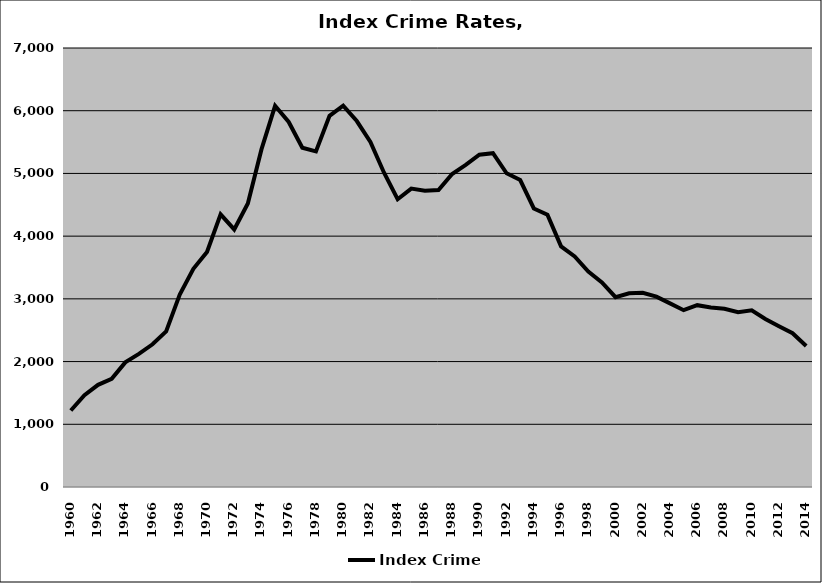
| Category | Index Crime |
|---|---|
| 1960.0 | 1219.113 |
| 1961.0 | 1462.744 |
| 1962.0 | 1629.665 |
| 1963.0 | 1725.872 |
| 1964.0 | 1987.617 |
| 1965.0 | 2121.447 |
| 1966.0 | 2275.255 |
| 1967.0 | 2482.144 |
| 1968.0 | 3067.905 |
| 1969.0 | 3478.562 |
| 1970.0 | 3746.311 |
| 1971.0 | 4347.551 |
| 1972.0 | 4107.085 |
| 1973.0 | 4520.987 |
| 1974.0 | 5382.948 |
| 1975.0 | 6077.831 |
| 1976.0 | 5820.899 |
| 1977.0 | 5409.045 |
| 1978.0 | 5350.416 |
| 1979.0 | 5917.941 |
| 1980.0 | 6079.146 |
| 1981.0 | 5835.373 |
| 1982.0 | 5503.736 |
| 1983.0 | 5010.768 |
| 1984.0 | 4588.427 |
| 1985.0 | 4757.798 |
| 1986.0 | 4723.337 |
| 1987.0 | 4733.817 |
| 1988.0 | 4990.887 |
| 1989.0 | 5136.005 |
| 1990.0 | 5297.864 |
| 1991.0 | 5322.348 |
| 1992.0 | 5002.851 |
| 1993.0 | 4893.945 |
| 1994.0 | 4441.003 |
| 1995.0 | 4341.62 |
| 1996.0 | 3837.131 |
| 1997.0 | 3675.188 |
| 1998.0 | 3435.871 |
| 1999.0 | 3262.421 |
| 2000.0 | 3026.115 |
| 2001.0 | 3087.938 |
| 2002.0 | 3097.107 |
| 2003.0 | 3035.968 |
| 2004.0 | 2928.482 |
| 2005.0 | 2819.224 |
| 2006.0 | 2899.463 |
| 2007.0 | 2861.613 |
| 2008.0 | 2842.031 |
| 2009.0 | 2785.752 |
| 2010.0 | 2817.172 |
| 2011.0 | 2679.899 |
| 2012.0 | 2563.796 |
| 2013.0 | 2452.543 |
| 2014.0 | 2248.433 |